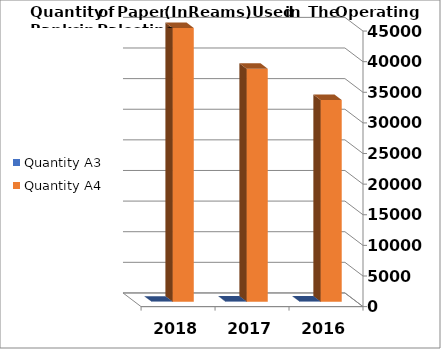
| Category | Quantity A3 | Quantity A4 |
|---|---|---|
| 2016.0 | 25 | 32950 |
| 2017.0 | 35 | 38050 |
| 2018.0 | 20 | 44707 |